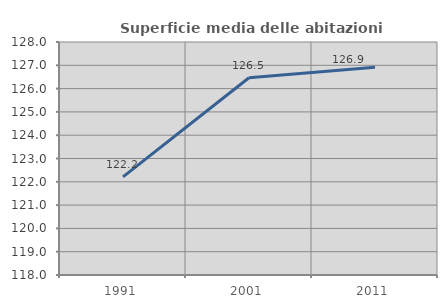
| Category | Superficie media delle abitazioni occupate |
|---|---|
| 1991.0 | 122.211 |
| 2001.0 | 126.468 |
| 2011.0 | 126.916 |